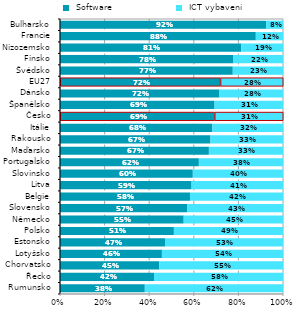
| Category |  Software |  ICT vybavení |
|---|---|---|
| Rumunsko | 0.38 | 0.62 |
| Řecko | 0.422 | 0.578 |
| Chorvatsko | 0.445 | 0.555 |
| Lotyšsko | 0.457 | 0.543 |
| Estonsko | 0.471 | 0.529 |
| Polsko | 0.511 | 0.489 |
| Německo | 0.555 | 0.445 |
| Slovensko | 0.571 | 0.429 |
| Belgie | 0.583 | 0.417 |
| Litva | 0.59 | 0.41 |
| Slovinsko | 0.596 | 0.404 |
| Portugalsko | 0.623 | 0.377 |
| Maďarsko | 0.668 | 0.332 |
| Rakousko | 0.675 | 0.325 |
| Itálie | 0.683 | 0.317 |
| Česko | 0.693 | 0.307 |
| Španělsko | 0.693 | 0.307 |
| Dánsko | 0.715 | 0.285 |
| EU27 | 0.719 | 0.281 |
| Švédsko | 0.775 | 0.225 |
| Finsko | 0.776 | 0.224 |
| Nizozemsko | 0.813 | 0.187 |
| Francie | 0.878 | 0.122 |
| Bulharsko | 0.924 | 0.076 |